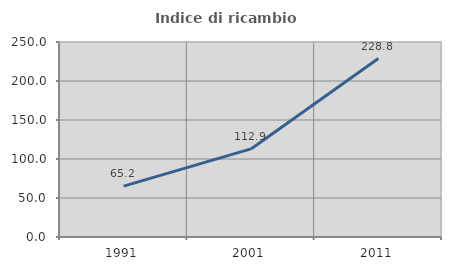
| Category | Indice di ricambio occupazionale  |
|---|---|
| 1991.0 | 65.192 |
| 2001.0 | 112.935 |
| 2011.0 | 228.835 |